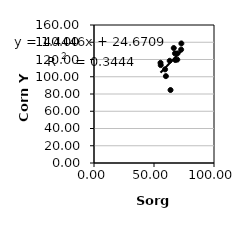
| Category | Series 0 |
|---|---|
| 67.74435384948409 | 119.375 |
| 69.39597379166271 | 119.844 |
| 63.77858880778589 | 84.613 |
| 55.428262631721154 | 116.165 |
| 63.076576080977006 | 118.503 |
| 59.25633232016211 | 108.581 |
| 72.6159336099585 | 131.48 |
| 59.91161956034096 | 100.705 |
| 72.80542783447348 | 138.608 |
| 55.61403720705484 | 113.453 |
| 67.47113687925385 | 127.051 |
| 69.54594824832286 | 127.043 |
| 66.46861444245981 | 133.3 |